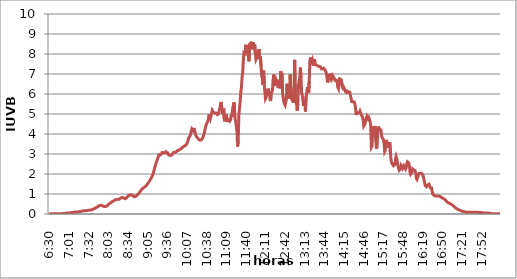
| Category | Series 0 |
|---|---|
| 0.2708333333333333 | 0.009 |
| 0.27152777777777776 | 0.009 |
| 0.2722222222222222 | 0.009 |
| 0.27291666666666664 | 0.009 |
| 0.2736111111111111 | 0.009 |
| 0.2743055555555555 | 0.009 |
| 0.275 | 0.009 |
| 0.27569444444444446 | 0.009 |
| 0.27638888888888885 | 0.009 |
| 0.27708333333333335 | 0.009 |
| 0.2777777777777778 | 0.009 |
| 0.27847222222222223 | 0.009 |
| 0.2791666666666667 | 0.009 |
| 0.2798611111111111 | 0.009 |
| 0.28055555555555556 | 0.019 |
| 0.28125 | 0.019 |
| 0.28194444444444444 | 0.019 |
| 0.2826388888888889 | 0.019 |
| 0.2833333333333333 | 0.019 |
| 0.28402777777777777 | 0.019 |
| 0.2847222222222222 | 0.019 |
| 0.28541666666666665 | 0.019 |
| 0.28611111111111115 | 0.028 |
| 0.28680555555555554 | 0.028 |
| 0.2875 | 0.028 |
| 0.2881944444444445 | 0.037 |
| 0.2888888888888889 | 0.037 |
| 0.28958333333333336 | 0.037 |
| 0.2902777777777778 | 0.047 |
| 0.29097222222222224 | 0.047 |
| 0.2916666666666667 | 0.047 |
| 0.2923611111111111 | 0.056 |
| 0.29305555555555557 | 0.056 |
| 0.29375 | 0.065 |
| 0.29444444444444445 | 0.065 |
| 0.2951388888888889 | 0.075 |
| 0.29583333333333334 | 0.075 |
| 0.2965277777777778 | 0.084 |
| 0.2972222222222222 | 0.084 |
| 0.29791666666666666 | 0.093 |
| 0.2986111111111111 | 0.093 |
| 0.29930555555555555 | 0.093 |
| 0.3 | 0.103 |
| 0.30069444444444443 | 0.103 |
| 0.3013888888888889 | 0.103 |
| 0.3020833333333333 | 0.112 |
| 0.30277777777777776 | 0.112 |
| 0.3034722222222222 | 0.121 |
| 0.30416666666666664 | 0.121 |
| 0.3048611111111111 | 0.13 |
| 0.3055555555555555 | 0.13 |
| 0.30625 | 0.14 |
| 0.3069444444444444 | 0.149 |
| 0.3076388888888889 | 0.149 |
| 0.30833333333333335 | 0.158 |
| 0.3090277777777778 | 0.158 |
| 0.30972222222222223 | 0.158 |
| 0.3104166666666667 | 0.168 |
| 0.3111111111111111 | 0.168 |
| 0.31180555555555556 | 0.177 |
| 0.3125 | 0.177 |
| 0.31319444444444444 | 0.177 |
| 0.3138888888888889 | 0.186 |
| 0.3145833333333333 | 0.186 |
| 0.31527777777777777 | 0.196 |
| 0.3159722222222222 | 0.196 |
| 0.31666666666666665 | 0.205 |
| 0.31736111111111115 | 0.214 |
| 0.31805555555555554 | 0.224 |
| 0.31875 | 0.242 |
| 0.3194444444444445 | 0.252 |
| 0.3201388888888889 | 0.27 |
| 0.32083333333333336 | 0.289 |
| 0.3215277777777778 | 0.308 |
| 0.32222222222222224 | 0.326 |
| 0.3229166666666667 | 0.345 |
| 0.3236111111111111 | 0.363 |
| 0.32430555555555557 | 0.382 |
| 0.325 | 0.401 |
| 0.32569444444444445 | 0.41 |
| 0.3263888888888889 | 0.429 |
| 0.32708333333333334 | 0.429 |
| 0.3277777777777778 | 0.438 |
| 0.3284722222222222 | 0.429 |
| 0.32916666666666666 | 0.41 |
| 0.3298611111111111 | 0.391 |
| 0.33055555555555555 | 0.382 |
| 0.33125 | 0.373 |
| 0.33194444444444443 | 0.373 |
| 0.3326388888888889 | 0.382 |
| 0.3333333333333333 | 0.382 |
| 0.3340277777777778 | 0.401 |
| 0.3347222222222222 | 0.429 |
| 0.3354166666666667 | 0.457 |
| 0.3361111111111111 | 0.494 |
| 0.3368055555555556 | 0.531 |
| 0.3375 | 0.55 |
| 0.33819444444444446 | 0.569 |
| 0.33888888888888885 | 0.587 |
| 0.33958333333333335 | 0.615 |
| 0.34027777777777773 | 0.634 |
| 0.34097222222222223 | 0.652 |
| 0.3416666666666666 | 0.671 |
| 0.3423611111111111 | 0.69 |
| 0.3430555555555555 | 0.708 |
| 0.34375 | 0.718 |
| 0.3444444444444445 | 0.727 |
| 0.3451388888888889 | 0.736 |
| 0.3458333333333334 | 0.736 |
| 0.34652777777777777 | 0.736 |
| 0.34722222222222227 | 0.736 |
| 0.34791666666666665 | 0.755 |
| 0.34861111111111115 | 0.783 |
| 0.34930555555555554 | 0.802 |
| 0.35 | 0.82 |
| 0.3506944444444444 | 0.829 |
| 0.3513888888888889 | 0.82 |
| 0.3520833333333333 | 0.811 |
| 0.3527777777777778 | 0.783 |
| 0.3534722222222222 | 0.764 |
| 0.3541666666666667 | 0.764 |
| 0.3548611111111111 | 0.783 |
| 0.35555555555555557 | 0.811 |
| 0.35625 | 0.848 |
| 0.35694444444444445 | 0.885 |
| 0.3576388888888889 | 0.923 |
| 0.35833333333333334 | 0.941 |
| 0.3590277777777778 | 0.96 |
| 0.3597222222222222 | 0.96 |
| 0.36041666666666666 | 0.96 |
| 0.3611111111111111 | 0.951 |
| 0.36180555555555555 | 0.932 |
| 0.3625 | 0.913 |
| 0.36319444444444443 | 0.885 |
| 0.3638888888888889 | 0.867 |
| 0.3645833333333333 | 0.867 |
| 0.3652777777777778 | 0.876 |
| 0.3659722222222222 | 0.895 |
| 0.3666666666666667 | 0.923 |
| 0.3673611111111111 | 0.951 |
| 0.3680555555555556 | 0.988 |
| 0.36875 | 1.025 |
| 0.36944444444444446 | 1.062 |
| 0.37013888888888885 | 1.109 |
| 0.37083333333333335 | 1.156 |
| 0.37152777777777773 | 1.202 |
| 0.37222222222222223 | 1.24 |
| 0.3729166666666666 | 1.277 |
| 0.3736111111111111 | 1.295 |
| 0.3743055555555555 | 1.314 |
| 0.375 | 1.342 |
| 0.3756944444444445 | 1.361 |
| 0.3763888888888889 | 1.389 |
| 0.3770833333333334 | 1.426 |
| 0.37777777777777777 | 1.463 |
| 0.37847222222222227 | 1.51 |
| 0.37916666666666665 | 1.556 |
| 0.37986111111111115 | 1.603 |
| 0.38055555555555554 | 1.65 |
| 0.38125 | 1.706 |
| 0.3819444444444444 | 1.752 |
| 0.3826388888888889 | 1.808 |
| 0.3833333333333333 | 1.873 |
| 0.3840277777777778 | 1.948 |
| 0.3847222222222222 | 2.05 |
| 0.3854166666666667 | 2.162 |
| 0.3861111111111111 | 2.283 |
| 0.38680555555555557 | 2.395 |
| 0.3875 | 2.488 |
| 0.38819444444444445 | 2.619 |
| 0.3888888888888889 | 2.684 |
| 0.38958333333333334 | 2.768 |
| 0.3902777777777778 | 2.88 |
| 0.3909722222222222 | 2.964 |
| 0.39166666666666666 | 2.936 |
| 0.3923611111111111 | 2.954 |
| 0.39305555555555555 | 2.964 |
| 0.39375 | 3.01 |
| 0.39444444444444443 | 3.076 |
| 0.3951388888888889 | 3.029 |
| 0.3958333333333333 | 3.057 |
| 0.3965277777777778 | 3.076 |
| 0.3972222222222222 | 3.076 |
| 0.3979166666666667 | 3.076 |
| 0.3986111111111111 | 3.113 |
| 0.3993055555555556 | 3.048 |
| 0.4 | 3.048 |
| 0.40069444444444446 | 3.048 |
| 0.40138888888888885 | 2.964 |
| 0.40208333333333335 | 2.936 |
| 0.40277777777777773 | 2.936 |
| 0.40347222222222223 | 2.926 |
| 0.4041666666666666 | 2.926 |
| 0.4048611111111111 | 2.954 |
| 0.4055555555555555 | 2.992 |
| 0.40625 | 3.029 |
| 0.4069444444444445 | 3.085 |
| 0.4076388888888889 | 3.066 |
| 0.4083333333333334 | 3.076 |
| 0.40902777777777777 | 3.094 |
| 0.40972222222222227 | 3.104 |
| 0.41041666666666665 | 3.132 |
| 0.41111111111111115 | 3.169 |
| 0.41180555555555554 | 3.169 |
| 0.4125 | 3.187 |
| 0.4131944444444444 | 3.215 |
| 0.4138888888888889 | 3.234 |
| 0.4145833333333333 | 3.234 |
| 0.4152777777777778 | 3.262 |
| 0.4159722222222222 | 3.29 |
| 0.4166666666666667 | 3.337 |
| 0.4173611111111111 | 3.355 |
| 0.41805555555555557 | 3.374 |
| 0.41875 | 3.392 |
| 0.41944444444444445 | 3.411 |
| 0.4201388888888889 | 3.439 |
| 0.42083333333333334 | 3.467 |
| 0.4215277777777778 | 3.523 |
| 0.4222222222222222 | 3.598 |
| 0.42291666666666666 | 3.7 |
| 0.4236111111111111 | 3.821 |
| 0.42430555555555555 | 3.831 |
| 0.425 | 3.905 |
| 0.42569444444444443 | 3.989 |
| 0.4263888888888889 | 4.166 |
| 0.4270833333333333 | 4.259 |
| 0.4277777777777778 | 4.287 |
| 0.4284722222222222 | 4.185 |
| 0.4291666666666667 | 4.297 |
| 0.4298611111111111 | 4.287 |
| 0.4305555555555556 | 4.045 |
| 0.43125 | 3.933 |
| 0.43194444444444446 | 3.877 |
| 0.43263888888888885 | 3.84 |
| 0.43333333333333335 | 3.803 |
| 0.43402777777777773 | 3.756 |
| 0.43472222222222223 | 3.719 |
| 0.4354166666666666 | 3.7 |
| 0.4361111111111111 | 3.691 |
| 0.4368055555555555 | 3.691 |
| 0.4375 | 3.709 |
| 0.4381944444444445 | 3.747 |
| 0.4388888888888889 | 3.812 |
| 0.4395833333333334 | 3.896 |
| 0.44027777777777777 | 3.998 |
| 0.44097222222222227 | 4.138 |
| 0.44166666666666665 | 4.297 |
| 0.44236111111111115 | 4.418 |
| 0.44305555555555554 | 4.436 |
| 0.44375 | 4.576 |
| 0.4444444444444444 | 4.641 |
| 0.4451388888888889 | 4.735 |
| 0.4458333333333333 | 4.977 |
| 0.4465277777777778 | 4.949 |
| 0.4472222222222222 | 4.772 |
| 0.4479166666666667 | 4.902 |
| 0.4486111111111111 | 4.921 |
| 0.44930555555555557 | 5.182 |
| 0.45 | 5.201 |
| 0.45069444444444445 | 5.061 |
| 0.4513888888888889 | 5.023 |
| 0.45208333333333334 | 5.051 |
| 0.4527777777777778 | 5.061 |
| 0.4534722222222222 | 5.051 |
| 0.45416666666666666 | 5.005 |
| 0.4548611111111111 | 4.968 |
| 0.45555555555555555 | 4.949 |
| 0.45625 | 5.005 |
| 0.45694444444444443 | 5.182 |
| 0.4576388888888889 | 5.284 |
| 0.4583333333333333 | 5.294 |
| 0.4590277777777778 | 5.601 |
| 0.4597222222222222 | 5.322 |
| 0.4604166666666667 | 5.07 |
| 0.4611111111111111 | 4.996 |
| 0.4618055555555556 | 5.284 |
| 0.4625 | 4.735 |
| 0.46319444444444446 | 4.632 |
| 0.46388888888888885 | 4.837 |
| 0.46458333333333335 | 4.996 |
| 0.46527777777777773 | 4.725 |
| 0.46597222222222223 | 4.595 |
| 0.4666666666666666 | 4.735 |
| 0.4673611111111111 | 4.772 |
| 0.4680555555555555 | 4.716 |
| 0.46875 | 4.66 |
| 0.4694444444444445 | 4.716 |
| 0.4701388888888889 | 4.94 |
| 0.4708333333333334 | 4.856 |
| 0.47152777777777777 | 5.163 |
| 0.47222222222222227 | 5.098 |
| 0.47291666666666665 | 5.573 |
| 0.47361111111111115 | 5.35 |
| 0.47430555555555554 | 4.753 |
| 0.475 | 4.651 |
| 0.4756944444444444 | 4.632 |
| 0.4763888888888889 | 4.129 |
| 0.4770833333333333 | 3.374 |
| 0.4777777777777778 | 3.635 |
| 0.4784722222222222 | 4.949 |
| 0.4791666666666667 | 4.996 |
| 0.4798611111111111 | 5.601 |
| 0.48055555555555557 | 6.105 |
| 0.48125 | 6.3 |
| 0.48194444444444445 | 6.841 |
| 0.4826388888888889 | 7.055 |
| 0.48333333333333334 | 7.68 |
| 0.4840277777777778 | 8.071 |
| 0.4847222222222222 | 8.118 |
| 0.48541666666666666 | 8.025 |
| 0.4861111111111111 | 8.463 |
| 0.48680555555555555 | 8.164 |
| 0.4875 | 8.127 |
| 0.48819444444444443 | 8.285 |
| 0.4888888888888889 | 7.875 |
| 0.4895833333333333 | 7.633 |
| 0.4902777777777778 | 8.369 |
| 0.4909722222222222 | 8.565 |
| 0.4916666666666667 | 8.435 |
| 0.4923611111111111 | 8.612 |
| 0.4930555555555556 | 8.239 |
| 0.49375 | 8.36 |
| 0.49444444444444446 | 8.593 |
| 0.49513888888888885 | 8.276 |
| 0.49583333333333335 | 8.472 |
| 0.49652777777777773 | 8.015 |
| 0.49722222222222223 | 7.717 |
| 0.4979166666666666 | 7.782 |
| 0.4986111111111111 | 8.071 |
| 0.4993055555555555 | 7.913 |
| 0.5 | 8.09 |
| 0.5006944444444444 | 8.248 |
| 0.5013888888888889 | 7.736 |
| 0.5020833333333333 | 7.885 |
| 0.5027777777777778 | 7.372 |
| 0.5034722222222222 | 6.869 |
| 0.5041666666666667 | 6.813 |
| 0.5048611111111111 | 6.449 |
| 0.5055555555555555 | 7.186 |
| 0.50625 | 6.524 |
| 0.5069444444444444 | 6.105 |
| 0.5076388888888889 | 5.769 |
| 0.5083333333333333 | 5.834 |
| 0.5090277777777777 | 6.021 |
| 0.5097222222222222 | 5.928 |
| 0.5104166666666666 | 6.263 |
| 0.5111111111111112 | 6.151 |
| 0.5118055555555555 | 6.095 |
| 0.5125 | 5.788 |
| 0.5131944444444444 | 5.648 |
| 0.513888888888889 | 6.039 |
| 0.5145833333333333 | 5.993 |
| 0.5152777777777778 | 6.188 |
| 0.5159722222222222 | 6.701 |
| 0.5166666666666667 | 6.971 |
| 0.517361111111111 | 6.403 |
| 0.5180555555555556 | 6.701 |
| 0.51875 | 6.757 |
| 0.5194444444444445 | 6.636 |
| 0.5201388888888888 | 6.72 |
| 0.5208333333333334 | 6.468 |
| 0.5215277777777778 | 6.505 |
| 0.5222222222222223 | 6.561 |
| 0.5229166666666667 | 6.282 |
| 0.5236111111111111 | 6.375 |
| 0.5243055555555556 | 7.148 |
| 0.525 | 6.86 |
| 0.5256944444444445 | 7.037 |
| 0.5263888888888889 | 6.011 |
| 0.5270833333333333 | 5.825 |
| 0.5277777777777778 | 5.611 |
| 0.5284722222222222 | 5.508 |
| 0.5291666666666667 | 5.443 |
| 0.5298611111111111 | 5.434 |
| 0.5305555555555556 | 5.75 |
| 0.53125 | 6.515 |
| 0.5319444444444444 | 5.825 |
| 0.5326388888888889 | 6.049 |
| 0.5333333333333333 | 5.778 |
| 0.5340277777777778 | 6.226 |
| 0.5347222222222222 | 6.981 |
| 0.5354166666666667 | 5.825 |
| 0.5361111111111111 | 5.769 |
| 0.5368055555555555 | 6.011 |
| 0.5375 | 5.816 |
| 0.5381944444444444 | 5.555 |
| 0.5388888888888889 | 6.356 |
| 0.5395833333333333 | 7.708 |
| 0.5402777777777777 | 6.049 |
| 0.5409722222222222 | 5.629 |
| 0.5416666666666666 | 5.489 |
| 0.5423611111111112 | 5.173 |
| 0.5430555555555555 | 5.517 |
| 0.54375 | 6.394 |
| 0.5444444444444444 | 6.664 |
| 0.545138888888889 | 6.757 |
| 0.5458333333333333 | 7.326 |
| 0.5465277777777778 | 6.832 |
| 0.5472222222222222 | 6.058 |
| 0.5479166666666667 | 5.946 |
| 0.548611111111111 | 5.704 |
| 0.5493055555555556 | 5.396 |
| 0.55 | 5.722 |
| 0.5506944444444445 | 5.611 |
| 0.5513888888888888 | 5.126 |
| 0.5520833333333334 | 5.872 |
| 0.5527777777777778 | 6.03 |
| 0.5534722222222223 | 6.338 |
| 0.5541666666666667 | 6.179 |
| 0.5548611111111111 | 6.049 |
| 0.5555555555555556 | 6.627 |
| 0.55625 | 7.642 |
| 0.5569444444444445 | 7.829 |
| 0.5576388888888889 | 7.838 |
| 0.5583333333333333 | 7.633 |
| 0.5590277777777778 | 7.717 |
| 0.5597222222222222 | 7.726 |
| 0.5604166666666667 | 7.409 |
| 0.5611111111111111 | 7.745 |
| 0.5618055555555556 | 7.586 |
| 0.5625 | 7.475 |
| 0.5631944444444444 | 7.484 |
| 0.5638888888888889 | 7.428 |
| 0.5645833333333333 | 7.4 |
| 0.5652777777777778 | 7.4 |
| 0.5659722222222222 | 7.409 |
| 0.5666666666666667 | 7.381 |
| 0.5673611111111111 | 7.363 |
| 0.5680555555555555 | 7.344 |
| 0.56875 | 7.26 |
| 0.5694444444444444 | 7.242 |
| 0.5701388888888889 | 7.251 |
| 0.5708333333333333 | 7.251 |
| 0.5715277777777777 | 7.288 |
| 0.5722222222222222 | 7.316 |
| 0.5729166666666666 | 7.204 |
| 0.5736111111111112 | 7.204 |
| 0.5743055555555555 | 7.046 |
| 0.575 | 6.804 |
| 0.5756944444444444 | 6.58 |
| 0.576388888888889 | 6.72 |
| 0.5770833333333333 | 6.943 |
| 0.5777777777777778 | 6.897 |
| 0.5784722222222222 | 6.962 |
| 0.5791666666666667 | 6.813 |
| 0.579861111111111 | 6.71 |
| 0.5805555555555556 | 6.766 |
| 0.58125 | 6.915 |
| 0.5819444444444445 | 6.887 |
| 0.5826388888888888 | 6.813 |
| 0.5833333333333334 | 6.785 |
| 0.5840277777777778 | 6.673 |
| 0.5847222222222223 | 6.673 |
| 0.5854166666666667 | 6.692 |
| 0.5861111111111111 | 6.636 |
| 0.5868055555555556 | 6.338 |
| 0.5875 | 6.272 |
| 0.5881944444444445 | 6.608 |
| 0.5888888888888889 | 6.757 |
| 0.5895833333333333 | 6.729 |
| 0.5902777777777778 | 6.729 |
| 0.5909722222222222 | 6.673 |
| 0.5916666666666667 | 6.366 |
| 0.5923611111111111 | 6.3 |
| 0.5930555555555556 | 6.356 |
| 0.59375 | 6.282 |
| 0.5944444444444444 | 6.216 |
| 0.5951388888888889 | 6.123 |
| 0.5958333333333333 | 6.123 |
| 0.5965277777777778 | 6.077 |
| 0.5972222222222222 | 6.142 |
| 0.5979166666666667 | 6.142 |
| 0.5986111111111111 | 6.105 |
| 0.5993055555555555 | 6.123 |
| 0.6 | 6.086 |
| 0.6006944444444444 | 6.049 |
| 0.6013888888888889 | 5.778 |
| 0.6020833333333333 | 5.62 |
| 0.6027777777777777 | 5.648 |
| 0.6034722222222222 | 5.611 |
| 0.6041666666666666 | 5.601 |
| 0.6048611111111112 | 5.601 |
| 0.6055555555555555 | 5.499 |
| 0.60625 | 5.331 |
| 0.6069444444444444 | 4.949 |
| 0.607638888888889 | 5.07 |
| 0.6083333333333333 | 5.061 |
| 0.6090277777777778 | 5.042 |
| 0.6097222222222222 | 5.042 |
| 0.6104166666666667 | 5.07 |
| 0.611111111111111 | 5.145 |
| 0.6118055555555556 | 5.126 |
| 0.6125 | 4.968 |
| 0.6131944444444445 | 4.912 |
| 0.6138888888888888 | 4.856 |
| 0.6145833333333334 | 4.725 |
| 0.6152777777777778 | 4.399 |
| 0.6159722222222223 | 4.39 |
| 0.6166666666666667 | 4.511 |
| 0.6173611111111111 | 4.52 |
| 0.6180555555555556 | 4.79 |
| 0.61875 | 4.884 |
| 0.6194444444444445 | 4.856 |
| 0.6201388888888889 | 4.763 |
| 0.6208333333333333 | 4.818 |
| 0.6215277777777778 | 4.828 |
| 0.6222222222222222 | 4.632 |
| 0.6229166666666667 | 4.408 |
| 0.6236111111111111 | 3.337 |
| 0.6243055555555556 | 3.392 |
| 0.625 | 4.129 |
| 0.6256944444444444 | 4.315 |
| 0.6263888888888889 | 4.278 |
| 0.6270833333333333 | 4.334 |
| 0.6277777777777778 | 4.399 |
| 0.6284722222222222 | 3.681 |
| 0.6291666666666667 | 3.271 |
| 0.6298611111111111 | 3.402 |
| 0.6305555555555555 | 4.064 |
| 0.63125 | 4.371 |
| 0.6319444444444444 | 4.38 |
| 0.6326388888888889 | 4.203 |
| 0.6333333333333333 | 4.241 |
| 0.6340277777777777 | 4.203 |
| 0.6347222222222222 | 3.933 |
| 0.6354166666666666 | 3.812 |
| 0.6361111111111112 | 3.803 |
| 0.6368055555555555 | 3.728 |
| 0.6375 | 3.56 |
| 0.6381944444444444 | 3.122 |
| 0.638888888888889 | 3.187 |
| 0.6395833333333333 | 3.7 |
| 0.6402777777777778 | 3.607 |
| 0.6409722222222222 | 3.402 |
| 0.6416666666666667 | 3.579 |
| 0.642361111111111 | 3.327 |
| 0.6430555555555556 | 3.514 |
| 0.64375 | 3.598 |
| 0.6444444444444445 | 3.122 |
| 0.6451388888888888 | 2.693 |
| 0.6458333333333334 | 2.563 |
| 0.6465277777777778 | 2.507 |
| 0.6472222222222223 | 2.46 |
| 0.6479166666666667 | 2.414 |
| 0.6486111111111111 | 2.405 |
| 0.6493055555555556 | 2.47 |
| 0.65 | 2.712 |
| 0.6506944444444445 | 2.871 |
| 0.6513888888888889 | 2.777 |
| 0.6520833333333333 | 2.591 |
| 0.6527777777777778 | 2.423 |
| 0.6534722222222222 | 2.283 |
| 0.6541666666666667 | 2.19 |
| 0.6548611111111111 | 2.144 |
| 0.6555555555555556 | 2.255 |
| 0.65625 | 2.414 |
| 0.6569444444444444 | 2.386 |
| 0.6576388888888889 | 2.283 |
| 0.6583333333333333 | 2.367 |
| 0.6590277777777778 | 2.423 |
| 0.6597222222222222 | 2.433 |
| 0.6604166666666667 | 2.311 |
| 0.6611111111111111 | 2.246 |
| 0.6618055555555555 | 2.321 |
| 0.6625 | 2.526 |
| 0.6631944444444444 | 2.61 |
| 0.6638888888888889 | 2.6 |
| 0.6645833333333333 | 2.554 |
| 0.6652777777777777 | 2.386 |
| 0.6659722222222222 | 2.078 |
| 0.6666666666666666 | 1.985 |
| 0.6673611111111111 | 1.939 |
| 0.6680555555555556 | 2.069 |
| 0.66875 | 2.255 |
| 0.6694444444444444 | 2.218 |
| 0.6701388888888888 | 2.2 |
| 0.6708333333333334 | 2.19 |
| 0.6715277777777778 | 2.172 |
| 0.6722222222222222 | 2.032 |
| 0.6729166666666666 | 1.789 |
| 0.6736111111111112 | 1.734 |
| 0.6743055555555556 | 1.817 |
| 0.675 | 1.957 |
| 0.6756944444444444 | 2.022 |
| 0.6763888888888889 | 2.032 |
| 0.6770833333333334 | 2.032 |
| 0.6777777777777777 | 2.041 |
| 0.6784722222222223 | 2.032 |
| 0.6791666666666667 | 2.004 |
| 0.6798611111111111 | 1.957 |
| 0.6805555555555555 | 1.864 |
| 0.68125 | 1.827 |
| 0.6819444444444445 | 1.566 |
| 0.6826388888888889 | 1.417 |
| 0.6833333333333332 | 1.37 |
| 0.6840277777777778 | 1.361 |
| 0.6847222222222222 | 1.351 |
| 0.6854166666666667 | 1.454 |
| 0.686111111111111 | 1.491 |
| 0.6868055555555556 | 1.491 |
| 0.6875 | 1.407 |
| 0.6881944444444444 | 1.314 |
| 0.688888888888889 | 1.333 |
| 0.6895833333333333 | 1.305 |
| 0.6902777777777778 | 1.128 |
| 0.6909722222222222 | 0.988 |
| 0.6916666666666668 | 0.96 |
| 0.6923611111111111 | 0.932 |
| 0.6930555555555555 | 0.913 |
| 0.69375 | 0.904 |
| 0.6944444444444445 | 0.904 |
| 0.6951388888888889 | 0.904 |
| 0.6958333333333333 | 0.913 |
| 0.6965277777777777 | 0.904 |
| 0.6972222222222223 | 0.904 |
| 0.6979166666666666 | 0.895 |
| 0.6986111111111111 | 0.876 |
| 0.6993055555555556 | 0.867 |
| 0.7 | 0.848 |
| 0.7006944444444444 | 0.82 |
| 0.7013888888888888 | 0.802 |
| 0.7020833333333334 | 0.783 |
| 0.7027777777777778 | 0.764 |
| 0.7034722222222222 | 0.746 |
| 0.7041666666666666 | 0.718 |
| 0.7048611111111112 | 0.69 |
| 0.7055555555555556 | 0.652 |
| 0.70625 | 0.615 |
| 0.7069444444444444 | 0.587 |
| 0.7076388888888889 | 0.569 |
| 0.7083333333333334 | 0.55 |
| 0.7090277777777777 | 0.541 |
| 0.7097222222222223 | 0.522 |
| 0.7104166666666667 | 0.503 |
| 0.7111111111111111 | 0.485 |
| 0.7118055555555555 | 0.466 |
| 0.7125 | 0.438 |
| 0.7131944444444445 | 0.419 |
| 0.7138888888888889 | 0.391 |
| 0.7145833333333332 | 0.354 |
| 0.7152777777777778 | 0.326 |
| 0.7159722222222222 | 0.298 |
| 0.7166666666666667 | 0.28 |
| 0.717361111111111 | 0.261 |
| 0.7180555555555556 | 0.242 |
| 0.71875 | 0.224 |
| 0.7194444444444444 | 0.205 |
| 0.720138888888889 | 0.196 |
| 0.7208333333333333 | 0.177 |
| 0.7215277777777778 | 0.168 |
| 0.7222222222222222 | 0.158 |
| 0.7229166666666668 | 0.14 |
| 0.7236111111111111 | 0.13 |
| 0.7243055555555555 | 0.121 |
| 0.725 | 0.112 |
| 0.7256944444444445 | 0.112 |
| 0.7263888888888889 | 0.103 |
| 0.7270833333333333 | 0.093 |
| 0.7277777777777777 | 0.093 |
| 0.7284722222222223 | 0.093 |
| 0.7291666666666666 | 0.093 |
| 0.7298611111111111 | 0.093 |
| 0.7305555555555556 | 0.093 |
| 0.73125 | 0.093 |
| 0.7319444444444444 | 0.093 |
| 0.7326388888888888 | 0.093 |
| 0.7333333333333334 | 0.093 |
| 0.7340277777777778 | 0.093 |
| 0.7347222222222222 | 0.093 |
| 0.7354166666666666 | 0.093 |
| 0.7361111111111112 | 0.093 |
| 0.7368055555555556 | 0.093 |
| 0.7375 | 0.093 |
| 0.7381944444444444 | 0.093 |
| 0.7388888888888889 | 0.093 |
| 0.7395833333333334 | 0.084 |
| 0.7402777777777777 | 0.084 |
| 0.7409722222222223 | 0.084 |
| 0.7416666666666667 | 0.084 |
| 0.7423611111111111 | 0.075 |
| 0.7430555555555555 | 0.075 |
| 0.74375 | 0.075 |
| 0.7444444444444445 | 0.065 |
| 0.7451388888888889 | 0.065 |
| 0.7458333333333332 | 0.065 |
| 0.7465277777777778 | 0.056 |
| 0.7472222222222222 | 0.056 |
| 0.7479166666666667 | 0.056 |
| 0.748611111111111 | 0.056 |
| 0.7493055555555556 | 0.047 |
| 0.75 | 0.047 |
| 0.7506944444444444 | 0.047 |
| 0.751388888888889 | 0.047 |
| 0.7520833333333333 | 0.047 |
| 0.7527777777777778 | 0.037 |
| 0.7534722222222222 | 0.037 |
| 0.7541666666666668 | 0.037 |
| 0.7548611111111111 | 0.028 |
| 0.7555555555555555 | 0.028 |
| 0.75625 | 0.019 |
| 0.7569444444444445 | 0.019 |
| 0.7576388888888889 | 0.019 |
| 0.7583333333333333 | 0.019 |
| 0.7590277777777777 | 0.019 |
| 0.7597222222222223 | 0.019 |
| 0.7604166666666666 | 0.019 |
| 0.7611111111111111 | 0.009 |
| 0.7618055555555556 | 0.009 |
| 0.7625 | 0.009 |
| 0.7631944444444444 | 0.009 |
| 0.7638888888888888 | 0.009 |
| 0.7645833333333334 | 0.009 |
| 0.7652777777777778 | 0.009 |